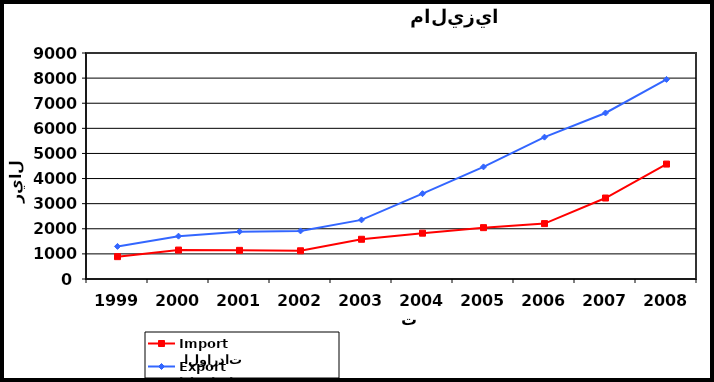
| Category |  الواردات           Import | الصادرات          Export |
|---|---|---|
| 1999.0 | 890 | 1298 |
| 2000.0 | 1152 | 1706 |
| 2001.0 | 1140 | 1884 |
| 2002.0 | 1124 | 1915 |
| 2003.0 | 1582 | 2354 |
| 2004.0 | 1825 | 3398 |
| 2005.0 | 2045 | 4465 |
| 2006.0 | 2206 | 5649 |
| 2007.0 | 3225 | 6611 |
| 2008.0 | 4577 | 7948 |